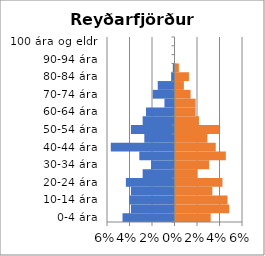
| Category | % karlar | %konur |
|---|---|---|
| 0-4 ára | -0.046 | 0.031 |
| 5-9 ára | -0.039 | 0.048 |
| 10-14 ára | -0.04 | 0.046 |
| 15-19 ára | -0.039 | 0.033 |
| 20-24 ára | -0.043 | 0.042 |
| 25-29 ára | -0.028 | 0.019 |
| 30-34 ára | -0.021 | 0.03 |
| 35-39 ára | -0.031 | 0.045 |
| 40-44 ára | -0.057 | 0.036 |
| 45-49 ára | -0.027 | 0.028 |
| 50-54 ára | -0.039 | 0.039 |
| 55-59 ára | -0.028 | 0.021 |
| 60-64 ára | -0.025 | 0.018 |
| 65-69 ára | -0.009 | 0.018 |
| 70-74 ára | -0.019 | 0.013 |
| 75-79 ára | -0.015 | 0.007 |
| 80-84 ára | -0.003 | 0.012 |
| 85-89 ára | -0.001 | 0.003 |
| 90-94 ára | 0 | 0 |
| 95-99 ára | 0 | 0 |
| 100 ára og eldri | 0 | 0 |